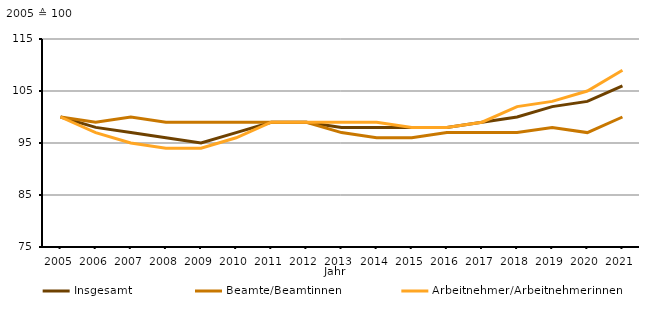
| Category | Insgesamt | Beamte/Beamtinnen | Arbeitnehmer/Arbeitnehmerinnen |
|---|---|---|---|
| 2005.0 | 100 | 100 | 100 |
| 2006.0 | 98 | 99 | 97 |
| 2007.0 | 97 | 100 | 95 |
| 2008.0 | 96 | 99 | 94 |
| 2009.0 | 95 | 99 | 94 |
| 2010.0 | 97 | 99 | 96 |
| 2011.0 | 99 | 99 | 99 |
| 2012.0 | 99 | 99 | 99 |
| 2013.0 | 98 | 97 | 99 |
| 2014.0 | 98 | 96 | 99 |
| 2015.0 | 98 | 96 | 98 |
| 2016.0 | 98 | 97 | 98 |
| 2017.0 | 99 | 97 | 99 |
| 2018.0 | 100 | 97 | 102 |
| 2019.0 | 102 | 98 | 103 |
| 2020.0 | 103 | 97 | 105 |
| 2021.0 | 106 | 100 | 109 |